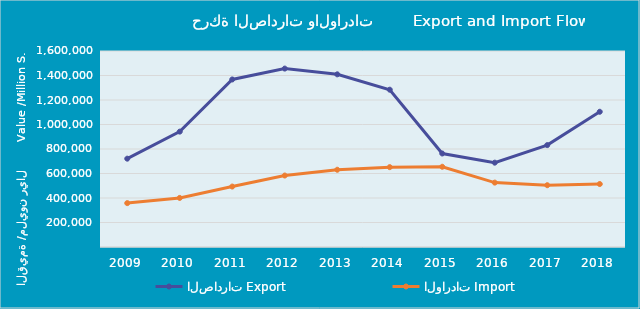
| Category | الصادرات | الواردات |
|---|---|---|
| 2009.0 | 721109334611 | 358290170148 |
| 2010.0 | 941785072434 | 400735520910 |
| 2011.0 | 1367619830684 | 493449082585 |
| 2012.0 | 1456502163451 | 583473067875 |
| 2013.0 | 1409523296716 | 630582433092 |
| 2014.0 | 1284121545536 | 651875760674 |
| 2015.0 | 763313062522 | 655033363532 |
| 2016.0 | 688423019366 | 525635962804 |
| 2017.0 | 831881287830 | 504446616737 |
| 2018.0 | 1103900485991 | 513992690199 |